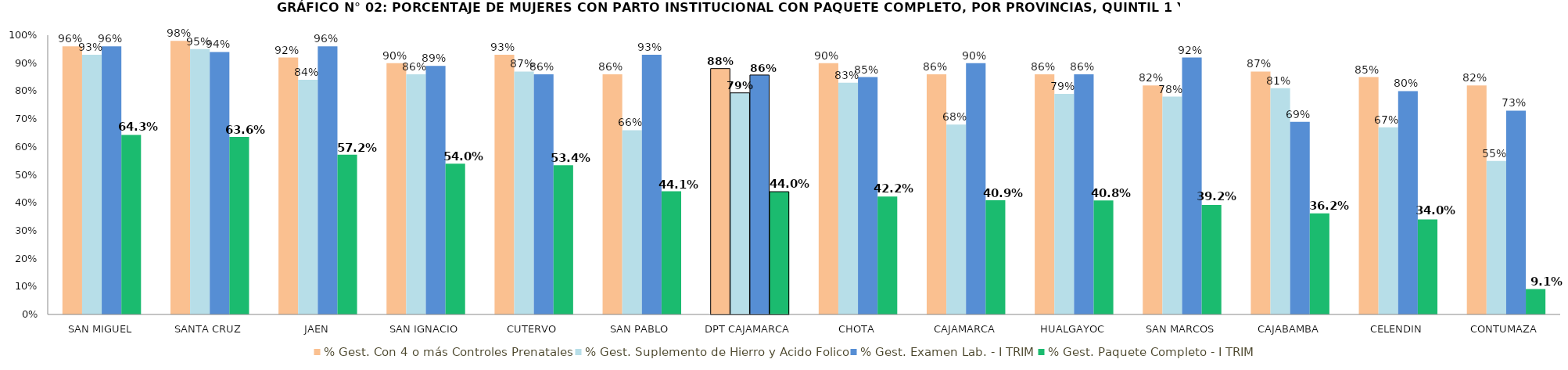
| Category | % Gest. Con 4 o más Controles Prenatales | % Gest. Suplemento de Hierro y Acido Folico | % Gest. Examen Lab. - I TRIM | % Gest. Paquete Completo - I TRIM |
|---|---|---|---|---|
| SAN MIGUEL | 0.96 | 0.93 | 0.96 | 0.643 |
| SANTA CRUZ | 0.98 | 0.95 | 0.94 | 0.636 |
| JAEN | 0.92 | 0.84 | 0.96 | 0.572 |
| SAN IGNACIO | 0.9 | 0.86 | 0.89 | 0.54 |
| CUTERVO | 0.93 | 0.87 | 0.86 | 0.534 |
| SAN PABLO | 0.86 | 0.66 | 0.93 | 0.441 |
| DPT CAJAMARCA | 0.88 | 0.793 | 0.857 | 0.44 |
| CHOTA | 0.9 | 0.83 | 0.85 | 0.422 |
| CAJAMARCA | 0.86 | 0.68 | 0.9 | 0.409 |
| HUALGAYOC | 0.86 | 0.79 | 0.86 | 0.408 |
| SAN MARCOS | 0.82 | 0.78 | 0.92 | 0.392 |
| CAJABAMBA | 0.87 | 0.81 | 0.69 | 0.362 |
| CELENDIN | 0.85 | 0.67 | 0.8 | 0.34 |
| CONTUMAZA | 0.82 | 0.55 | 0.73 | 0.091 |